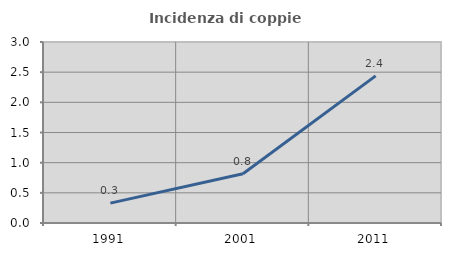
| Category | Incidenza di coppie miste |
|---|---|
| 1991.0 | 0.329 |
| 2001.0 | 0.817 |
| 2011.0 | 2.439 |